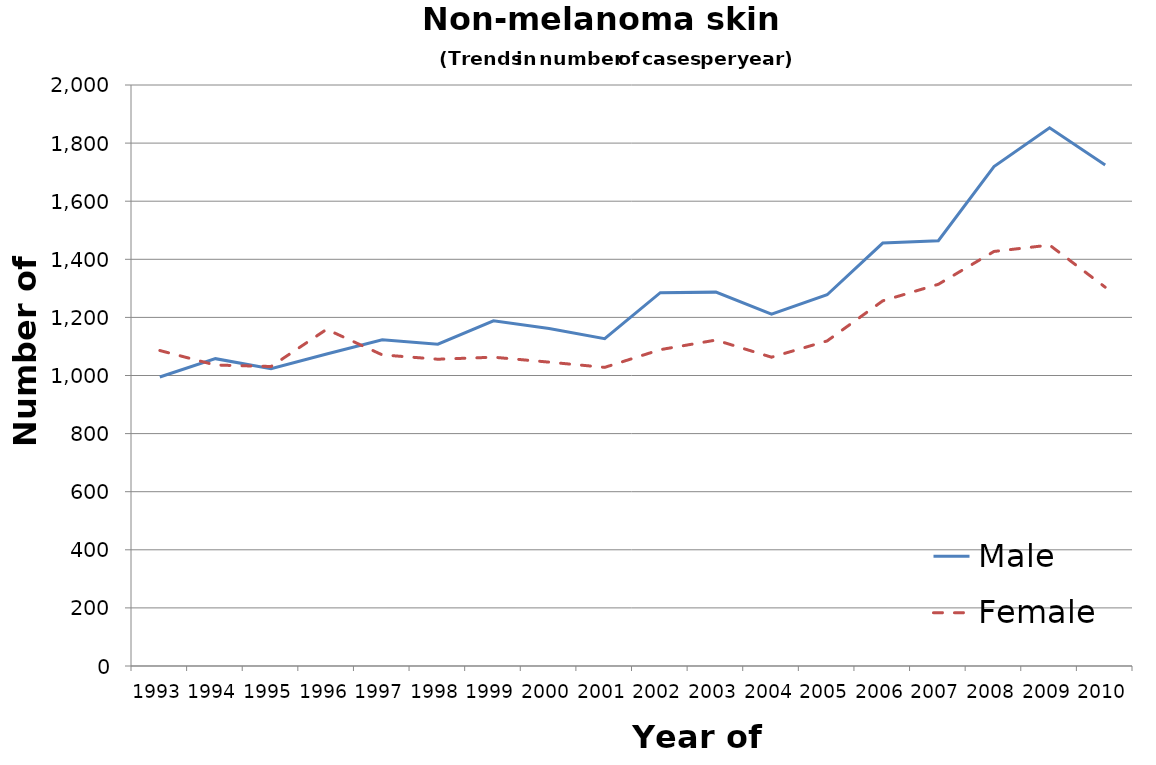
| Category | Male | Female |
|---|---|---|
| 1993.0 | 995 | 1086 |
| 1994.0 | 1058 | 1036 |
| 1995.0 | 1023 | 1031 |
| 1996.0 | 1074 | 1159 |
| 1997.0 | 1123 | 1071 |
| 1998.0 | 1108 | 1056 |
| 1999.0 | 1188 | 1063 |
| 2000.0 | 1162 | 1046 |
| 2001.0 | 1127 | 1028 |
| 2002.0 | 1285 | 1089 |
| 2003.0 | 1287 | 1122 |
| 2004.0 | 1211 | 1063 |
| 2005.0 | 1278 | 1119 |
| 2006.0 | 1456 | 1257 |
| 2007.0 | 1464 | 1314 |
| 2008.0 | 1719 | 1427 |
| 2009.0 | 1853 | 1449 |
| 2010.0 | 1725 | 1304 |